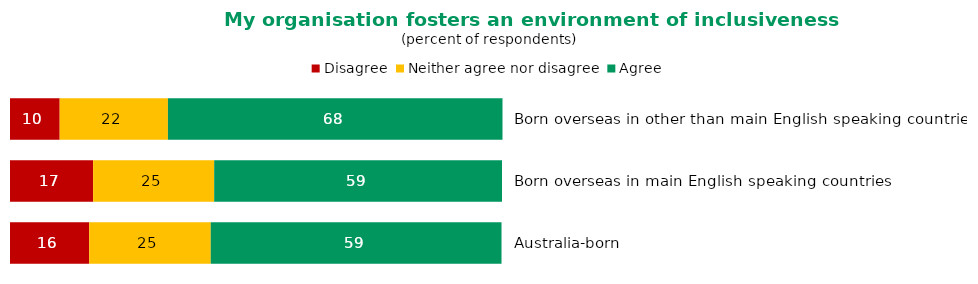
| Category | Series 0 | Disagree | Neither agree nor disagree | Agree |
|---|---|---|---|---|
| Born overseas in other than main English speaking countries |  | 10.1 | 22 | 68 |
| Born overseas in main English speaking countries |  | 16.9 | 24.6 | 58.5 |
| Australia-born |  | 16.1 | 24.7 | 59.1 |